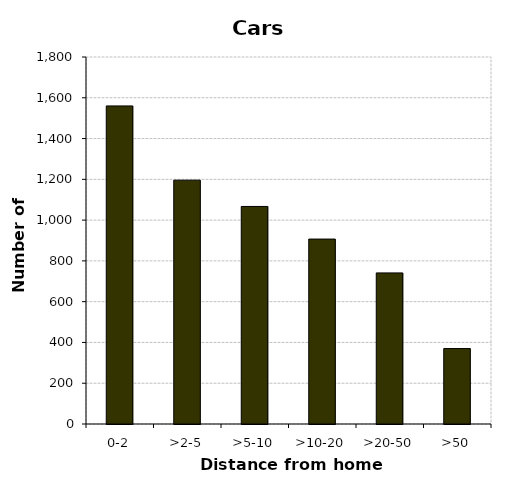
| Category | Cars |
|---|---|
| 0-2 | 1560 |
| >2-5 | 1196 |
| >5-10 | 1067 |
| >10-20 | 907 |
| >20-50 | 741 |
| >50 | 370 |